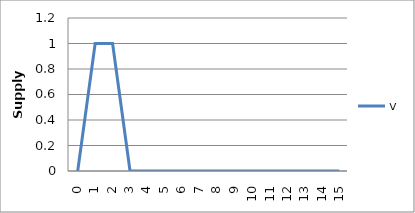
| Category | v |
|---|---|
| 0.0 | 0 |
| 1.0 | 1 |
| 2.0 | 1 |
| 3.0 | 0 |
| 4.0 | 0 |
| 5.0 | 0 |
| 6.0 | 0 |
| 7.0 | 0 |
| 8.0 | 0 |
| 9.0 | 0 |
| 10.0 | 0 |
| 11.0 | 0 |
| 12.0 | 0 |
| 13.0 | 0 |
| 14.0 | 0 |
| 15.0 | 0 |